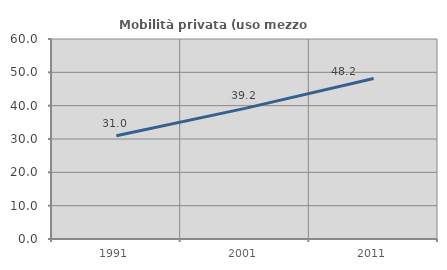
| Category | Mobilità privata (uso mezzo privato) |
|---|---|
| 1991.0 | 30.972 |
| 2001.0 | 39.191 |
| 2011.0 | 48.17 |